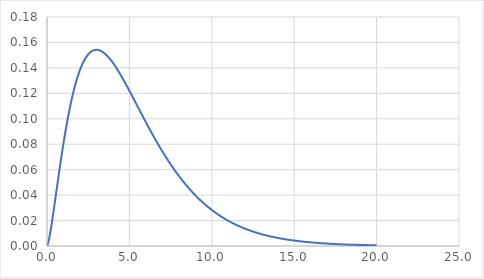
| Category | Series 0 |
|---|---|
| 0.0 | 0 |
| 0.1 | 0.004 |
| 0.2 | 0.011 |
| 0.3 | 0.019 |
| 0.4 | 0.028 |
| 0.5 | 0.037 |
| 0.6 | 0.046 |
| 0.7 | 0.055 |
| 0.8 | 0.064 |
| 0.9 | 0.072 |
| 1.0 | 0.081 |
| 1.1 | 0.089 |
| 1.2 | 0.096 |
| 1.3 | 0.103 |
| 1.4 | 0.109 |
| 1.5 | 0.115 |
| 1.6 | 0.121 |
| 1.7 | 0.126 |
| 1.8 | 0.131 |
| 1.9 | 0.135 |
| 2.0 | 0.138 |
| 2.1 | 0.142 |
| 2.2 | 0.144 |
| 2.3 | 0.147 |
| 2.4 | 0.149 |
| 2.5 | 0.151 |
| 2.6 | 0.152 |
| 2.7 | 0.153 |
| 2.8 | 0.154 |
| 2.9 | 0.154 |
| 3.0 | 0.154 |
| 3.1 | 0.154 |
| 3.2 | 0.154 |
| 3.3 | 0.153 |
| 3.4 | 0.152 |
| 3.5 | 0.151 |
| 3.6 | 0.15 |
| 3.7 | 0.149 |
| 3.8 | 0.147 |
| 3.9 | 0.146 |
| 4.0 | 0.144 |
| 4.1 | 0.142 |
| 4.2 | 0.14 |
| 4.3 | 0.138 |
| 4.4 | 0.136 |
| 4.5 | 0.134 |
| 4.6 | 0.132 |
| 4.7 | 0.129 |
| 4.8 | 0.127 |
| 4.9 | 0.124 |
| 5.0 | 0.122 |
| 5.1 | 0.12 |
| 5.2 | 0.117 |
| 5.3 | 0.115 |
| 5.4 | 0.112 |
| 5.5 | 0.11 |
| 5.6 | 0.107 |
| 5.7 | 0.105 |
| 5.8 | 0.102 |
| 5.9 | 0.1 |
| 6.0 | 0.097 |
| 6.1 | 0.095 |
| 6.2 | 0.092 |
| 6.3 | 0.09 |
| 6.4 | 0.088 |
| 6.5 | 0.085 |
| 6.6 | 0.083 |
| 6.7 | 0.081 |
| 6.8 | 0.079 |
| 6.9 | 0.077 |
| 7.0 | 0.074 |
| 7.1 | 0.072 |
| 7.2 | 0.07 |
| 7.3 | 0.068 |
| 7.4 | 0.066 |
| 7.5 | 0.064 |
| 7.6 | 0.062 |
| 7.7 | 0.06 |
| 7.8 | 0.059 |
| 7.9 | 0.057 |
| 8.0 | 0.055 |
| 8.1 | 0.053 |
| 8.2 | 0.052 |
| 8.3 | 0.05 |
| 8.4 | 0.049 |
| 8.5 | 0.047 |
| 8.6 | 0.046 |
| 8.7 | 0.044 |
| 8.8 | 0.043 |
| 8.9 | 0.041 |
| 9.0 | 0.04 |
| 9.1 | 0.039 |
| 9.2 | 0.037 |
| 9.3 | 0.036 |
| 9.4 | 0.035 |
| 9.5 | 0.034 |
| 9.6 | 0.033 |
| 9.7 | 0.031 |
| 9.8 | 0.03 |
| 9.9 | 0.029 |
| 10.0 | 0.028 |
| 10.1 | 0.027 |
| 10.2 | 0.026 |
| 10.3 | 0.025 |
| 10.4 | 0.025 |
| 10.5 | 0.024 |
| 10.6 | 0.023 |
| 10.7 | 0.022 |
| 10.8 | 0.021 |
| 10.9 | 0.021 |
| 11.0 | 0.02 |
| 11.1 | 0.019 |
| 11.2 | 0.018 |
| 11.3 | 0.018 |
| 11.4 | 0.017 |
| 11.5 | 0.017 |
| 11.6 | 0.016 |
| 11.7 | 0.015 |
| 11.8 | 0.015 |
| 11.9 | 0.014 |
| 12.0 | 0.014 |
| 12.1 | 0.013 |
| 12.2 | 0.013 |
| 12.3 | 0.012 |
| 12.4 | 0.012 |
| 12.5 | 0.011 |
| 12.6 | 0.011 |
| 12.7 | 0.011 |
| 12.8 | 0.01 |
| 12.9 | 0.01 |
| 13.0 | 0.009 |
| 13.1 | 0.009 |
| 13.2 | 0.009 |
| 13.3 | 0.008 |
| 13.4 | 0.008 |
| 13.5 | 0.008 |
| 13.6 | 0.007 |
| 13.7 | 0.007 |
| 13.8 | 0.007 |
| 13.9 | 0.007 |
| 14.0 | 0.006 |
| 14.1 | 0.006 |
| 14.2 | 0.006 |
| 14.3 | 0.006 |
| 14.4 | 0.005 |
| 14.5 | 0.005 |
| 14.6 | 0.005 |
| 14.7 | 0.005 |
| 14.8 | 0.005 |
| 14.9 | 0.004 |
| 15.0 | 0.004 |
| 15.1 | 0.004 |
| 15.2 | 0.004 |
| 15.3 | 0.004 |
| 15.4 | 0.004 |
| 15.5 | 0.003 |
| 15.6 | 0.003 |
| 15.7 | 0.003 |
| 15.8 | 0.003 |
| 15.9 | 0.003 |
| 16.0 | 0.003 |
| 16.1 | 0.003 |
| 16.2 | 0.003 |
| 16.3 | 0.003 |
| 16.4 | 0.002 |
| 16.5 | 0.002 |
| 16.6 | 0.002 |
| 16.7 | 0.002 |
| 16.8 | 0.002 |
| 16.9 | 0.002 |
| 17.0 | 0.002 |
| 17.1 | 0.002 |
| 17.2 | 0.002 |
| 17.3 | 0.002 |
| 17.4 | 0.002 |
| 17.5 | 0.002 |
| 17.6 | 0.001 |
| 17.7 | 0.001 |
| 17.8 | 0.001 |
| 17.9 | 0.001 |
| 18.0 | 0.001 |
| 18.1 | 0.001 |
| 18.2 | 0.001 |
| 18.3 | 0.001 |
| 18.4 | 0.001 |
| 18.5 | 0.001 |
| 18.6 | 0.001 |
| 18.7 | 0.001 |
| 18.8 | 0.001 |
| 18.9 | 0.001 |
| 19.0 | 0.001 |
| 19.1 | 0.001 |
| 19.2 | 0.001 |
| 19.3 | 0.001 |
| 19.4 | 0.001 |
| 19.5 | 0.001 |
| 19.6 | 0.001 |
| 19.7 | 0.001 |
| 19.8 | 0.001 |
| 19.9 | 0.001 |
| 20.0 | 0.001 |